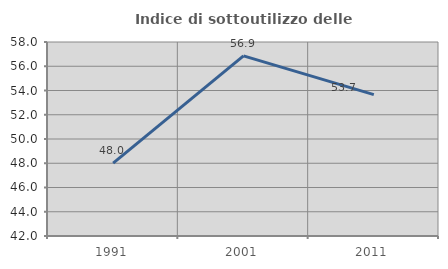
| Category | Indice di sottoutilizzo delle abitazioni  |
|---|---|
| 1991.0 | 48.014 |
| 2001.0 | 56.859 |
| 2011.0 | 53.659 |